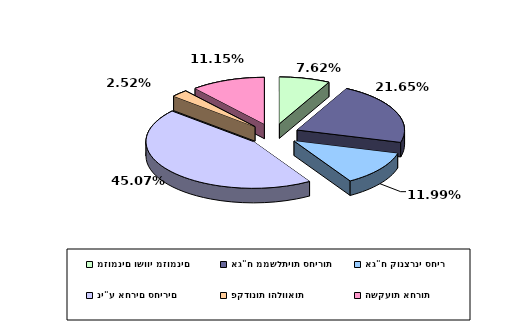
| Category | Series 0 |
|---|---|
| מזומנים ושווי מזומנים | 0.076 |
| אג"ח ממשלתיות סחירות | 0.216 |
| אג"ח קונצרני סחיר | 0.12 |
| ני"ע אחרים סחירים | 0.451 |
| פקדונות והלוואות | 0.025 |
| השקעות אחרות | 0.112 |